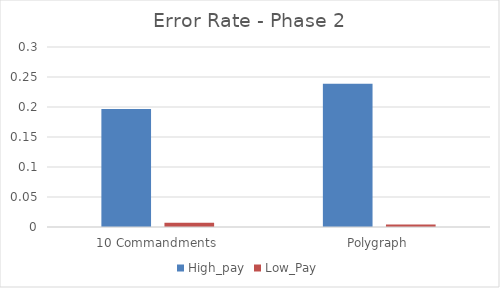
| Category | High_pay | Low_Pay |
|---|---|---|
| 10 Commandments | 0.197 | 0.007 |
| Polygraph | 0.239 | 0.004 |